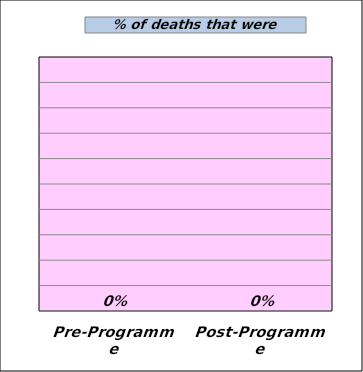
| Category | Expected  |
|---|---|
| Pre-Programme | 0 |
| Post-Programme | 0 |